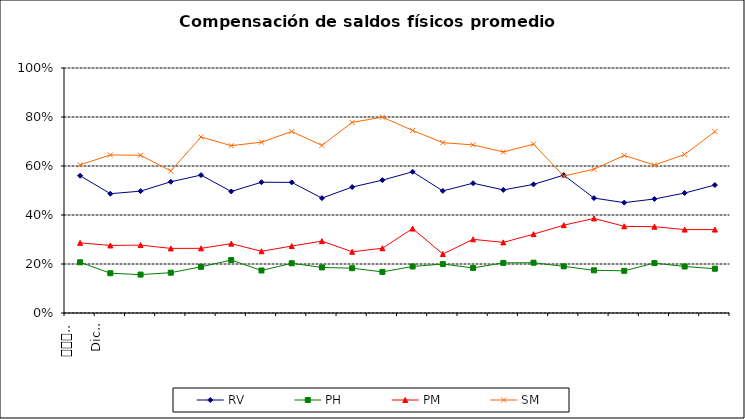
| Category | RV | PH | PM | SM |
|---|---|---|---|---|
| 0 | 0.56 | 0.207 | 0.286 | 0.605 |
| 1 | 0.487 | 0.162 | 0.276 | 0.645 |
| 2 | 0.497 | 0.157 | 0.277 | 0.644 |
| 3 | 0.536 | 0.164 | 0.264 | 0.58 |
| 4 | 0.563 | 0.188 | 0.264 | 0.718 |
| 5 | 0.496 | 0.216 | 0.283 | 0.683 |
| 6 | 0.534 | 0.174 | 0.252 | 0.697 |
| 7 | 0.533 | 0.203 | 0.273 | 0.741 |
| 8 | 0.469 | 0.186 | 0.293 | 0.684 |
| 9 | 0.514 | 0.183 | 0.25 | 0.778 |
| 10 | 0.542 | 0.168 | 0.264 | 0.8 |
| 11 | 0.576 | 0.19 | 0.345 | 0.745 |
| 12 | 0.498 | 0.2 | 0.241 | 0.695 |
| 13 | 0.53 | 0.184 | 0.301 | 0.686 |
| 14 | 0.502 | 0.205 | 0.288 | 0.657 |
| 15 | 0.525 | 0.205 | 0.322 | 0.689 |
| 16 | 0.563 | 0.19 | 0.358 | 0.559 |
| 17 | 0.469 | 0.174 | 0.386 | 0.587 |
| 18 | 0.45 | 0.172 | 0.354 | 0.643 |
| 19 | 0.465 | 0.204 | 0.352 | 0.604 |
| 20 | 0.49 | 0.19 | 0.34 | 0.647 |
| 21 | 0.522 | 0.181 | 0.34 | 0.74 |